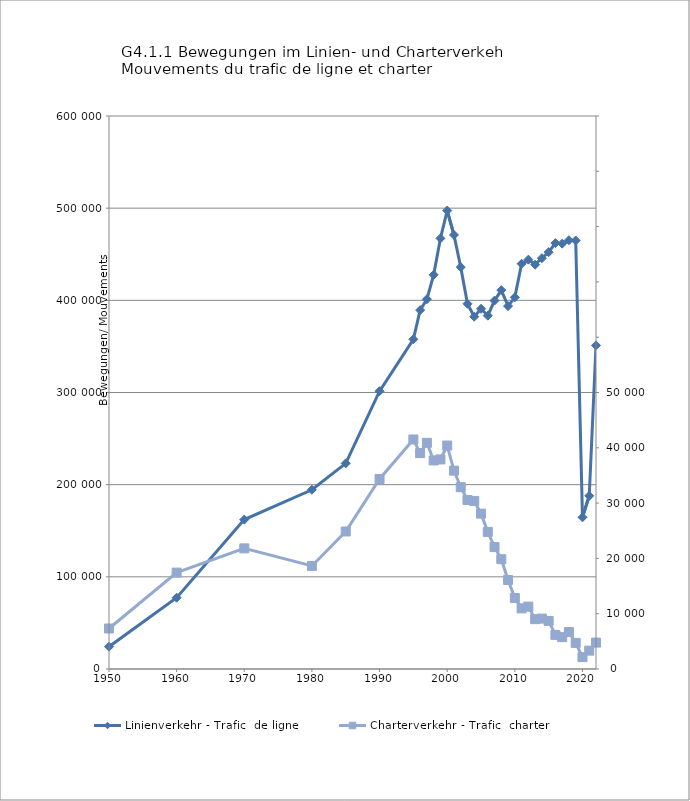
| Category | Linienverkehr - Trafic  de ligne |
|---|---|
| 1950.0 | 24166 |
| 1960.0 | 77337 |
| 1970.0 | 162118 |
| 1980.0 | 194463 |
| 1985.0 | 223154 |
| 1990.0 | 301420 |
| 1995.0 | 357731 |
| 1996.0 | 389383 |
| 1997.0 | 401195 |
| 1998.0 | 427694 |
| 1999.0 | 467220 |
| 2000.0 | 497403 |
| 2001.0 | 470947 |
| 2002.0 | 436018 |
| 2003.0 | 396268 |
| 2004.0 | 382229 |
| 2005.0 | 390862 |
| 2006.0 | 383343 |
| 2007.0 | 399730 |
| 2008.0 | 411090 |
| 2009.0 | 393747 |
| 2010.0 | 403286 |
| 2011.0 | 439725 |
| 2012.0 | 444138 |
| 2013.0 | 438725 |
| 2014.0 | 445723 |
| 2015.0 | 452286 |
| 2016.0 | 462059 |
| 2017.0 | 461501 |
| 2018.0 | 465191 |
| 2019.0 | 464945 |
| 2020.0 | 164609 |
| 2021.0 | 187896 |
| 2022.0 | 351139 |